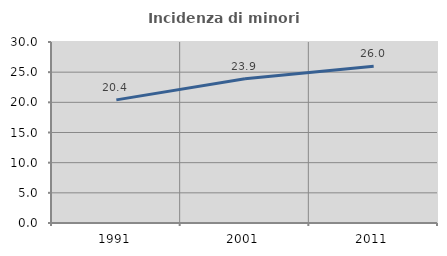
| Category | Incidenza di minori stranieri |
|---|---|
| 1991.0 | 20.408 |
| 2001.0 | 23.913 |
| 2011.0 | 25.964 |